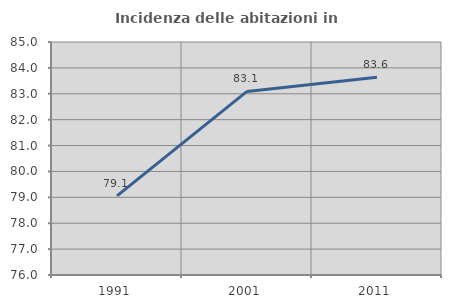
| Category | Incidenza delle abitazioni in proprietà  |
|---|---|
| 1991.0 | 79.058 |
| 2001.0 | 83.092 |
| 2011.0 | 83.636 |